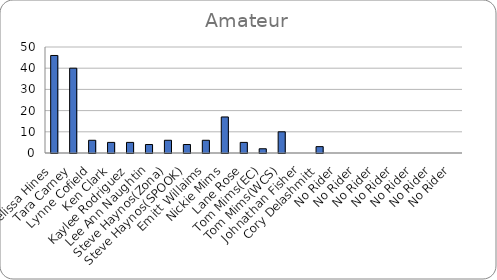
| Category | Totals |
|---|---|
| Melissa Hines | 46 |
| Tara Carney | 40 |
| Lynne Cofield | 6 |
| Ken Clark | 5 |
| Kaylee Rodriguez | 5 |
| Lee Ann Naughtin | 4 |
| Steve Haynos(Zona) | 6 |
| Steve Haynos(SPOOK) | 4 |
| Emitt Willaims | 6 |
| Nickie Mims | 17 |
| Lane Rose | 5 |
| Tom Mims(EC) | 2 |
| Tom Mims(WCS) | 10 |
| Johnathan Fisher | 0 |
| Cory Delashmitt | 3 |
| No Rider | 0 |
| No Rider | 0 |
| No Rider | 0 |
| No Rider | 0 |
| No Rider | 0 |
| No Rider | 0 |
| No Rider | 0 |